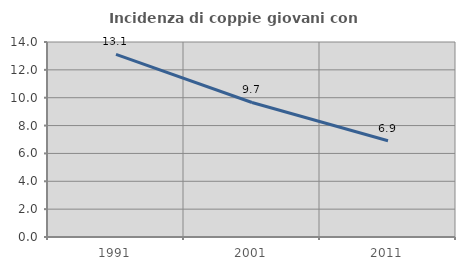
| Category | Incidenza di coppie giovani con figli |
|---|---|
| 1991.0 | 13.115 |
| 2001.0 | 9.659 |
| 2011.0 | 6.915 |